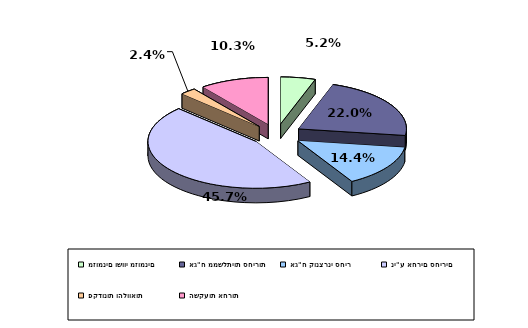
| Category | Series 0 |
|---|---|
| מזומנים ושווי מזומנים | 0.052 |
| אג"ח ממשלתיות סחירות | 0.22 |
| אג"ח קונצרני סחיר | 0.144 |
| ני"ע אחרים סחירים | 0.457 |
| פקדונות והלוואות | 0.024 |
| השקעות אחרות | 0.103 |